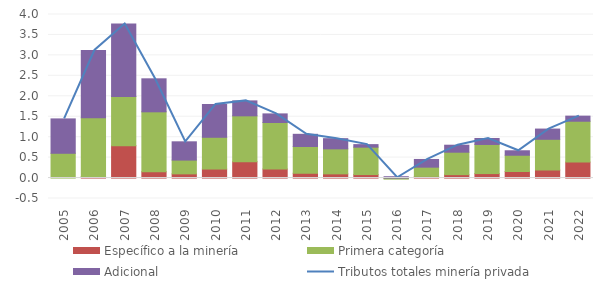
| Category | Específico a la minería | Primera categoría | Adicional |
|---|---|---|---|
| 2005.0 | 0 | 0.606 | 0.841 |
| 2006.0 | 0.038 | 1.439 | 1.644 |
| 2007.0 | 0.792 | 1.201 | 1.775 |
| 2008.0 | 0.155 | 1.465 | 0.807 |
| 2009.0 | 0.102 | 0.337 | 0.447 |
| 2010.0 | 0.22 | 0.777 | 0.802 |
| 2011.0 | 0.4 | 1.122 | 0.366 |
| 2012.0 | 0.221 | 1.137 | 0.211 |
| 2013.0 | 0.117 | 0.654 | 0.298 |
| 2014.0 | 0.102 | 0.612 | 0.249 |
| 2015.0 | 0.085 | 0.67 | 0.062 |
| 2016.0 | -0.001 | -0.024 | 0.033 |
| 2017.0 | 0.04 | 0.226 | 0.189 |
| 2018.0 | 0.083 | 0.549 | 0.171 |
| 2019.0 | 0.109 | 0.712 | 0.146 |
| 2020.0 | 0.16 | 0.398 | 0.109 |
| 2021.0 | 0.197 | 0.751 | 0.25 |
| 2022.0 | 0.391 | 0.999 | 0.125 |